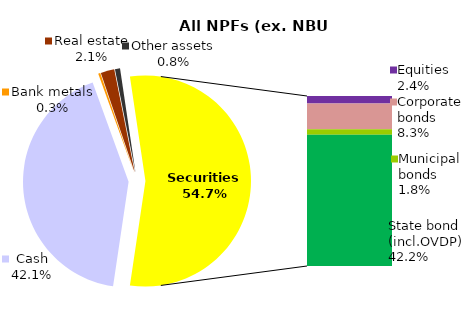
| Category | All NPF (ex. NBU CNPF) |
|---|---|
| Cash | 696.32 |
| Bank metals | 5.312 |
| Real estate | 34.47 |
| Other assets | 12.848 |
| Equities | 40.246 |
| Corporate bonds | 137.067 |
| Municipal bonds | 29.272 |
| State bond (incl.OVDP) | 697.886 |